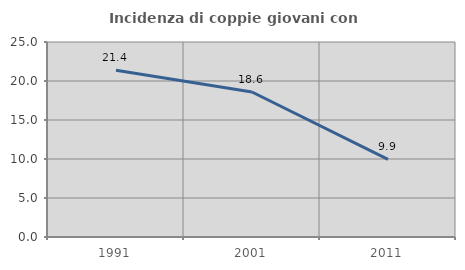
| Category | Incidenza di coppie giovani con figli |
|---|---|
| 1991.0 | 21.378 |
| 2001.0 | 18.593 |
| 2011.0 | 9.949 |